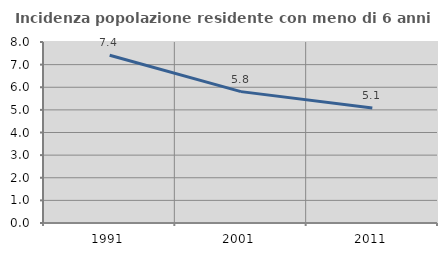
| Category | Incidenza popolazione residente con meno di 6 anni |
|---|---|
| 1991.0 | 7.416 |
| 2001.0 | 5.806 |
| 2011.0 | 5.083 |